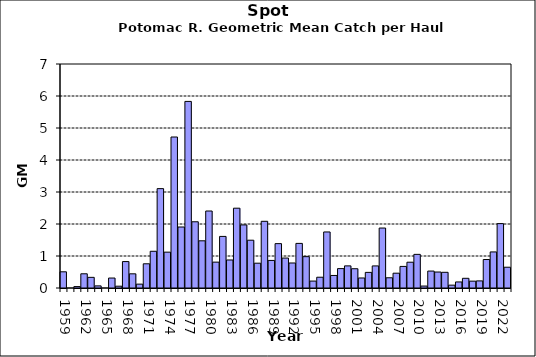
| Category | Series 0 |
|---|---|
| 1959.0 | 0.506 |
| 1960.0 | 0 |
| 1961.0 | 0.044 |
| 1962.0 | 0.444 |
| 1963.0 | 0.333 |
| 1964.0 | 0.066 |
| 1965.0 | 0 |
| 1966.0 | 0.311 |
| 1967.0 | 0.056 |
| 1968.0 | 0.826 |
| 1969.0 | 0.443 |
| 1970.0 | 0.121 |
| 1971.0 | 0.756 |
| 1972.0 | 1.148 |
| 1973.0 | 3.105 |
| 1974.0 | 1.12 |
| 1975.0 | 4.718 |
| 1976.0 | 1.906 |
| 1977.0 | 5.831 |
| 1978.0 | 2.07 |
| 1979.0 | 1.475 |
| 1980.0 | 2.406 |
| 1981.0 | 0.808 |
| 1982.0 | 1.612 |
| 1983.0 | 0.876 |
| 1984.0 | 2.494 |
| 1985.0 | 1.971 |
| 1986.0 | 1.493 |
| 1987.0 | 0.775 |
| 1988.0 | 2.084 |
| 1989.0 | 0.862 |
| 1990.0 | 1.386 |
| 1991.0 | 0.936 |
| 1992.0 | 0.781 |
| 1993.0 | 1.394 |
| 1994.0 | 0.979 |
| 1995.0 | 0.216 |
| 1996.0 | 0.337 |
| 1997.0 | 1.751 |
| 1998.0 | 0.392 |
| 1999.0 | 0.606 |
| 2000.0 | 0.691 |
| 2001.0 | 0.602 |
| 2002.0 | 0.313 |
| 2003.0 | 0.488 |
| 2004.0 | 0.69 |
| 2005.0 | 1.874 |
| 2006.0 | 0.32 |
| 2007.0 | 0.462 |
| 2008.0 | 0.674 |
| 2009.0 | 0.806 |
| 2010.0 | 1.051 |
| 2011.0 | 0.061 |
| 2012.0 | 0.529 |
| 2013.0 | 0.499 |
| 2014.0 | 0.49 |
| 2015.0 | 0.089 |
| 2016.0 | 0.189 |
| 2017.0 | 0.303 |
| 2018.0 | 0.214 |
| 2019.0 | 0.222 |
| 2020.0 | 0.89 |
| 2021.0 | 1.127 |
| 2022.0 | 2.012 |
| 2023.0 | 0.649 |